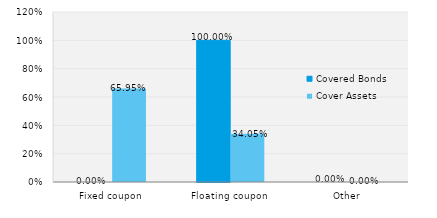
| Category | Covered Bonds | Cover Assets |
|---|---|---|
| Fixed coupon | 0 | 0.659 |
| Floating coupon | 1 | 0.341 |
| Other | 0 | 0 |